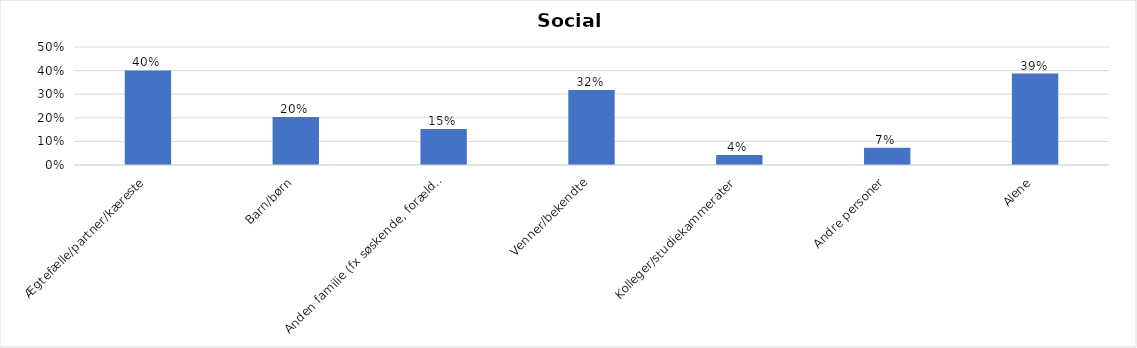
| Category | % |
|---|---|
| Ægtefælle/partner/kæreste | 0.401 |
| Barn/børn | 0.204 |
| Anden familie (fx søskende, forældre) | 0.153 |
| Venner/bekendte | 0.318 |
| Kolleger/studiekammerater | 0.043 |
| Andre personer | 0.073 |
| Alene | 0.388 |